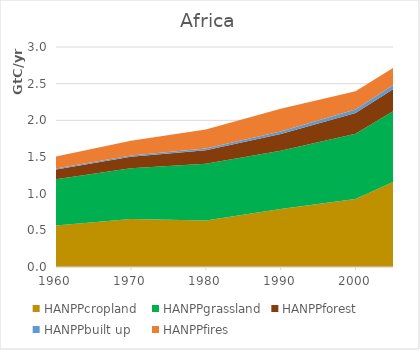
| Category | HANPPcropland | HANPPgrassland | HANPPforest | HANPPbuilt up | HANPPfires |
|---|---|---|---|---|---|
| 1960.0 | 566477.358 | 629550.04 | 133969.51 | 13448.411 | 161844.792 |
| 1970.0 | 656238.544 | 691069.379 | 154967.936 | 17737.862 | 201016.203 |
| 1980.0 | 634938.151 | 773062.406 | 185357.747 | 23378.554 | 259438.44 |
| 1990.0 | 791672.074 | 793118.231 | 228937.298 | 33125.953 | 309745.728 |
| 2000.0 | 928295.409 | 887238.03 | 282956.572 | 49193.943 | 249119.743 |
| 2005.0 | 1157655.164 | 966031.098 | 301127.691 | 53783.016 | 236139.806 |